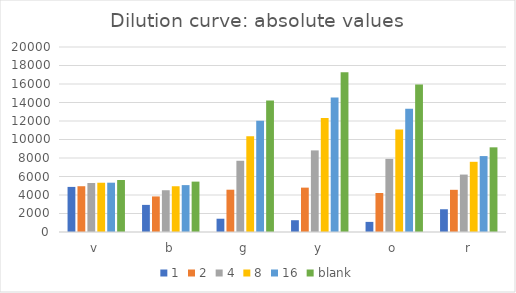
| Category | 1 | 2 | 4 | 8 | 16 | blank |
|---|---|---|---|---|---|---|
| v | 4875 | 4948 | 5299 | 5326 | 5331 | 5619 |
| b | 2931 | 3844 | 4515 | 4946 | 5069 | 5446 |
| g | 1435 | 4572 | 7700 | 10348 | 12031 | 14228 |
| y | 1273 | 4797 | 8822 | 12326 | 14532 | 17278 |
| o | 1093 | 4217 | 7906 | 11088 | 13314 | 15938 |
| r | 2459 | 4561 | 6209 | 7589 | 8208 | 9154 |